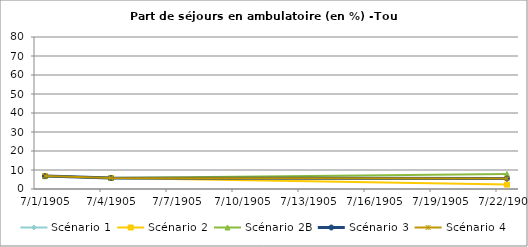
| Category | Scénario 1 | Scénario 2 | Scénario 2B | Scénario 3 | Scénario 4 |
|---|---|---|---|---|---|
| 2009.0 | 6.8 | 6.8 | 6.8 | 6.8 | 6.8 |
| 2012.0 | 5.795 | 5.795 | 5.795 | 5.795 | 5.795 |
| 2030.0 | 5.474 | 2.318 | 7.851 | 5.474 | 5.474 |